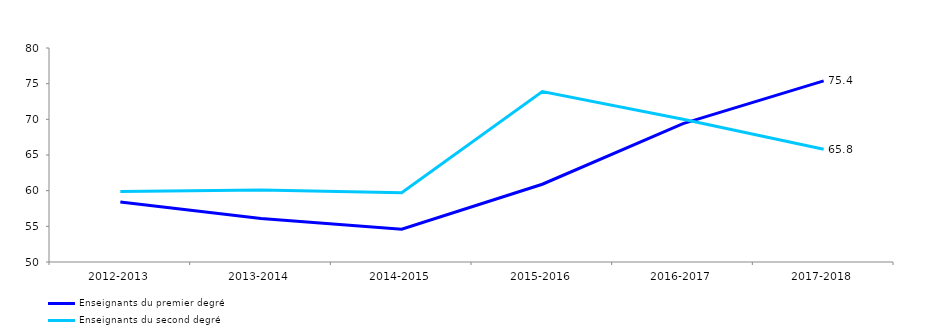
| Category | Enseignants du premier degré | Enseignants du second degré |
|---|---|---|
| 2012-2013 | 58.4 | 59.9 |
| 2013-2014 | 56.1 | 60.1 |
| 2014-2015 | 54.6 | 59.7 |
| 2015-2016 | 60.9 | 73.9 |
| 2016-2017 | 69.4 | 70 |
| 2017-2018 | 75.4 | 65.8 |